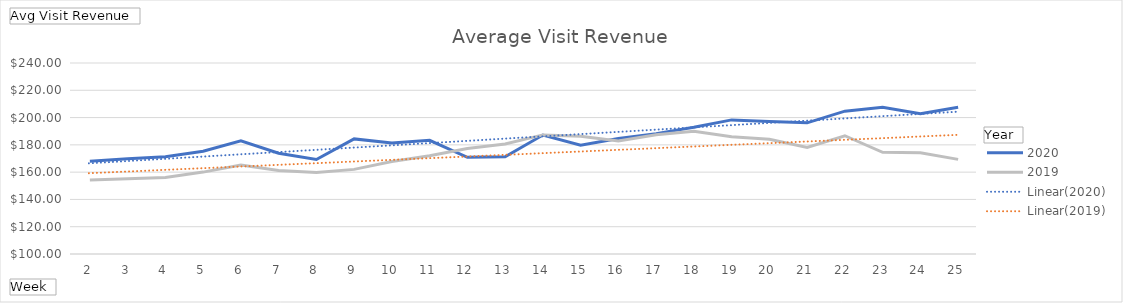
| Category | 2020 | 2019 |
|---|---|---|
| 2 | 168.001 | 154.152 |
| 3 | 169.824 | 155.187 |
| 4 | 171.349 | 156.128 |
| 5 | 175.343 | 160.029 |
| 6 | 183.02 | 165.249 |
| 7 | 173.832 | 161.21 |
| 8 | 169.286 | 159.66 |
| 9 | 184.376 | 162.023 |
| 10 | 181.321 | 167.741 |
| 11 | 183.298 | 172.063 |
| 12 | 170.866 | 177.362 |
| 13 | 171.32 | 180.653 |
| 14 | 187.233 | 187.292 |
| 15 | 179.689 | 186.309 |
| 16 | 184.693 | 182.781 |
| 17 | 188.242 | 187.465 |
| 18 | 192.862 | 189.982 |
| 19 | 198.305 | 186.014 |
| 20 | 197.139 | 184.12 |
| 21 | 196.122 | 178.165 |
| 22 | 204.697 | 186.685 |
| 23 | 207.592 | 174.533 |
| 24 | 202.758 | 174.246 |
| 25 | 207.589 | 169.364 |